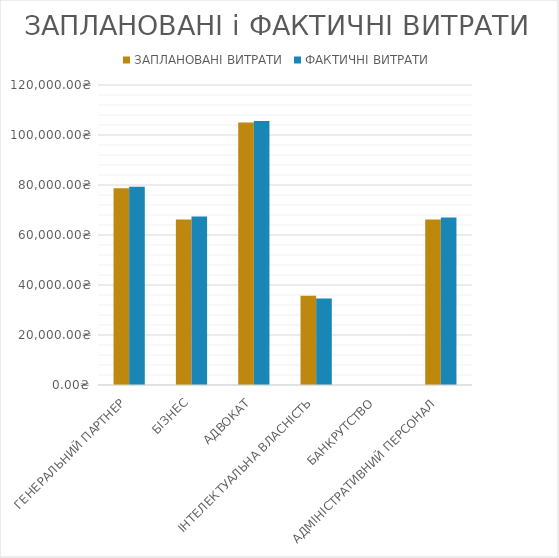
| Category | ЗАПЛАНОВАНІ ВИТРАТИ | ФАКТИЧНІ ВИТРАТИ |
|---|---|---|
| ГЕНЕРАЛЬНИЙ ПАРТНЕР | 78750 | 79275 |
| БІЗНЕС | 66250 | 67375 |
| АДВОКАТ | 105000 | 105600 |
| ІНТЕЛЕКТУАЛЬНА ВЛАСНІСТЬ | 35750 | 34650 |
| БАНКРУТСТВО | 0 | 0 |
| АДМІНІСТРАТИВНИЙ ПЕРСОНАЛ | 66250 | 67000 |